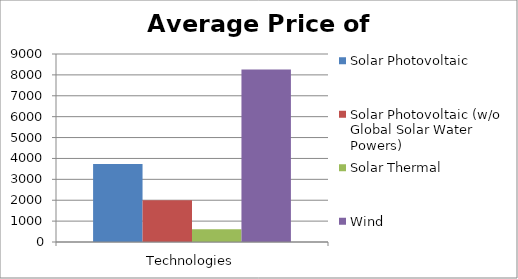
| Category | Solar Photovoltaic | Solar Photovoltaic (w/o Global Solar Water Powers) | Solar Thermal | Wind |
|---|---|---|---|---|
| 0 | 3739 | 1996 | 610 | 8252 |